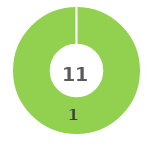
| Category | Series 0 |
|---|---|
| 0 | 0 |
| 1 | 1 |
| 2 | 0 |
| 3 | 0 |
| 4 | 0 |